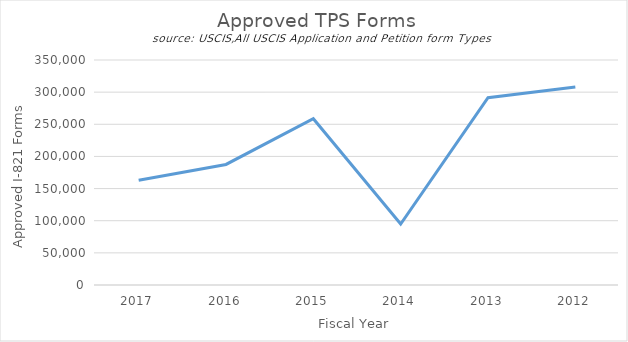
| Category | Approved TPS Forms |
|---|---|
| 2017.0 | 163093 |
| 2016.0 | 187521 |
| 2015.0 | 258722 |
| 2014.0 | 94837 |
| 2013.0 | 291258 |
| 2012.0 | 308062 |